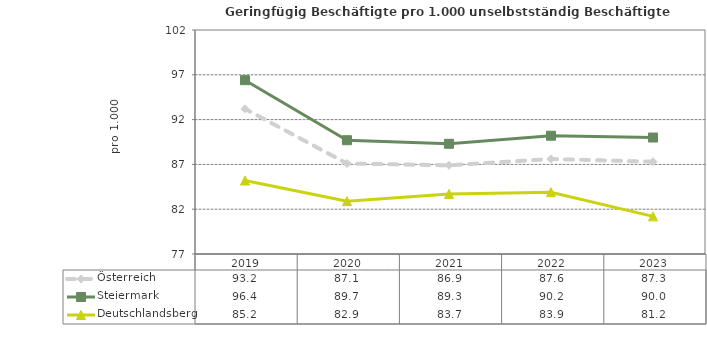
| Category | Österreich | Steiermark | Deutschlandsberg |
|---|---|---|---|
| 2023.0 | 87.3 | 90 | 81.2 |
| 2022.0 | 87.6 | 90.2 | 83.9 |
| 2021.0 | 86.9 | 89.3 | 83.7 |
| 2020.0 | 87.1 | 89.7 | 82.9 |
| 2019.0 | 93.2 | 96.4 | 85.2 |